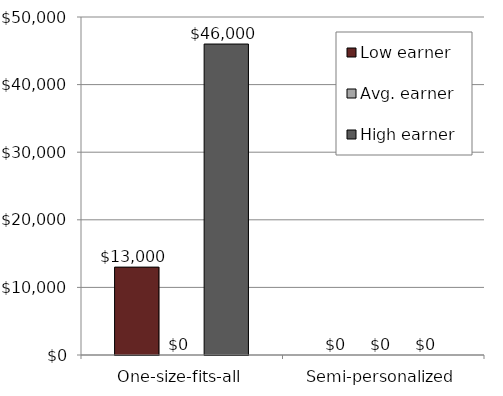
| Category | Low earner | Avg. earner | High earner |
|---|---|---|---|
| One-size-fits-all | 13000 | 0 | 46000 |
| Semi-personalized | 0 | 0 | 0 |